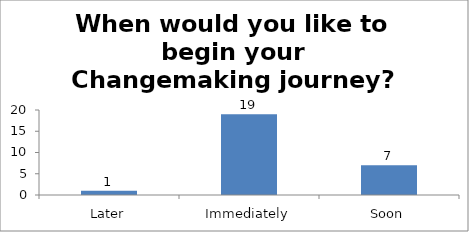
| Category | When would you like to begin your Changemaking journey?  |
|---|---|
| Later | 1 |
| Immediately | 19 |
| Soon | 7 |